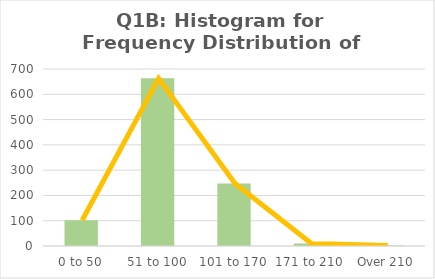
| Category | Series 0 |
|---|---|
| 0 to 50 | 102 |
| 51 to 100 | 663 |
| 101 to 170 | 247 |
| 171 to 210 | 10 |
| Over 210 | 2 |